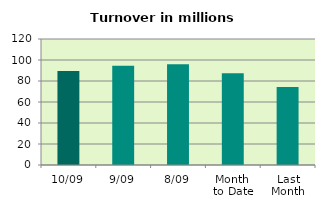
| Category | Series 0 |
|---|---|
| 10/09 | 89.628 |
| 9/09 | 94.623 |
| 8/09 | 96.004 |
| Month 
to Date | 87.362 |
| Last
Month | 74.221 |